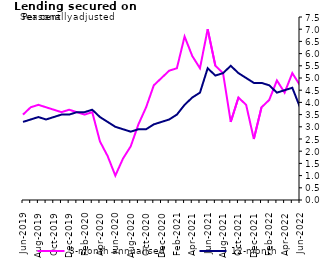
| Category | 3-month annualised | 12-month |
|---|---|---|
| Jun-2019 | 3.5 | 3.2 |
| Jul-2019 | 3.8 | 3.3 |
| Aug-2019 | 3.9 | 3.4 |
| Sep-2019 | 3.8 | 3.3 |
| Oct-2019 | 3.7 | 3.4 |
| Nov-2019 | 3.6 | 3.5 |
| Dec-2019 | 3.7 | 3.5 |
| Jan-2020 | 3.6 | 3.6 |
| Feb-2020 | 3.5 | 3.6 |
| Mar-2020 | 3.6 | 3.7 |
| Apr-2020 | 2.4 | 3.4 |
| May-2020 | 1.8 | 3.2 |
| Jun-2020 | 1 | 3 |
| Jul-2020 | 1.7 | 2.9 |
| Aug-2020 | 2.2 | 2.8 |
| Sep-2020 | 3.1 | 2.9 |
| Oct-2020 | 3.8 | 2.9 |
| Nov-2020 | 4.7 | 3.1 |
| Dec-2020 | 5 | 3.2 |
| Jan-2021 | 5.3 | 3.3 |
| Feb-2021 | 5.4 | 3.5 |
| Mar-2021 | 6.7 | 3.9 |
| Apr-2021 | 5.9 | 4.2 |
| May-2021 | 5.4 | 4.4 |
| Jun-2021 | 7 | 5.4 |
| Jul-2021 | 5.5 | 5.1 |
| Aug-2021 | 5.2 | 5.2 |
| Sep-2021 | 3.2 | 5.5 |
| Oct-2021 | 4.2 | 5.2 |
| Nov-2021 | 3.9 | 5 |
| Dec-2021 | 2.5 | 4.8 |
| Jan-2022 | 3.8 | 4.8 |
| Feb-2022 | 4.1 | 4.7 |
| Mar-2022 | 4.9 | 4.4 |
| Apr-2022 | 4.4 | 4.5 |
| May-2022 | 5.2 | 4.6 |
| Jun-2022 | 4.7 | 3.8 |